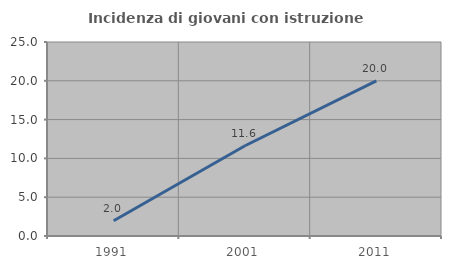
| Category | Incidenza di giovani con istruzione universitaria |
|---|---|
| 1991.0 | 1.961 |
| 2001.0 | 11.628 |
| 2011.0 | 20 |